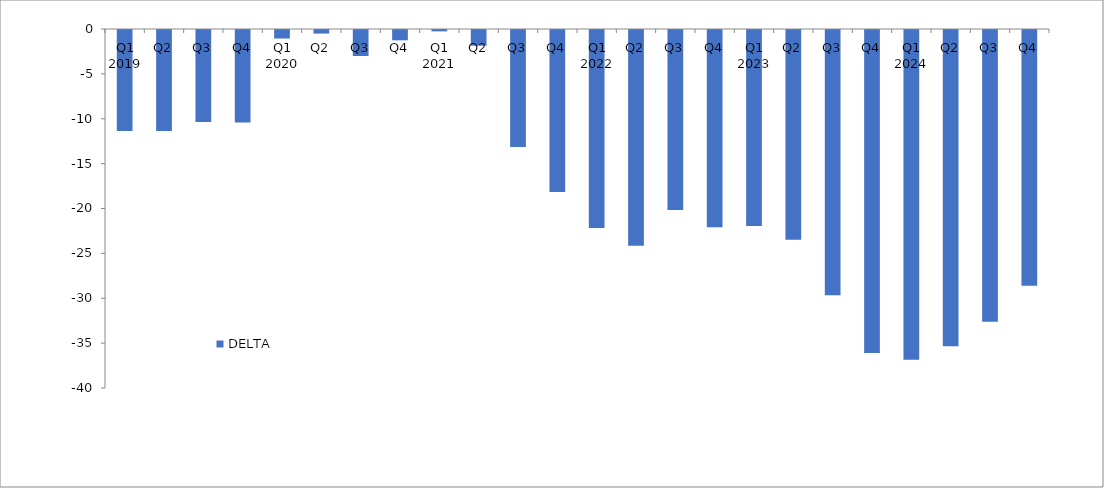
| Category | DELTA |
|---|---|
| 0 | -11.25 |
| 1 | -11.25 |
| 2 | -10.25 |
| 3 | -10.3 |
| 4 | -0.95 |
| 5 | -0.4 |
| 6 | -2.9 |
| 7 | -1.15 |
| 8 | -0.15 |
| 9 | -1.75 |
| 10 | -13.05 |
| 11 | -18.05 |
| 12 | -22.05 |
| 13 | -24.05 |
| 14 | -20.05 |
| 15 | -21.975 |
| 16 | -21.85 |
| 17 | -23.36 |
| 18 | -29.55 |
| 19 | -36 |
| 20 | -36.75 |
| 21 | -35.25 |
| 22 | -32.5 |
| 23 | -28.5 |